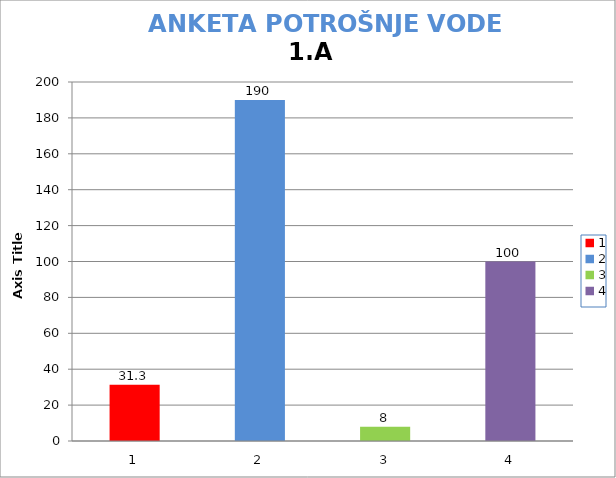
| Category | prosječna potrošnja | stvarna potrošnja | minimalna potrošnja | maksimalna potrošnja |
|---|---|---|---|---|
| 0 | 31.3 |  |  |  |
| 1 | 190 |  |  |  |
| 2 | 8 |  |  |  |
| 3 | 100 |  |  |  |